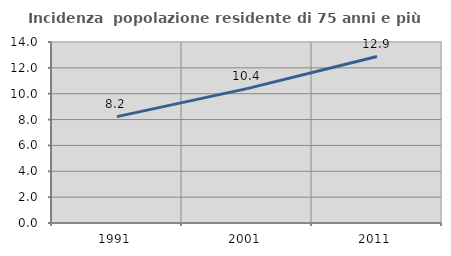
| Category | Incidenza  popolazione residente di 75 anni e più |
|---|---|
| 1991.0 | 8.23 |
| 2001.0 | 10.393 |
| 2011.0 | 12.878 |